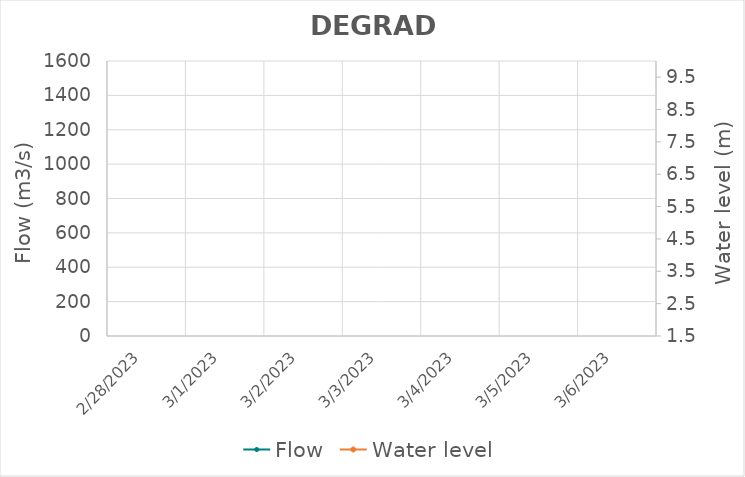
| Category | Flow |
|---|---|
| 4/26/22 | 772.27 |
| 4/25/22 | 760.98 |
| 4/24/22 | 723 |
| 4/23/22 | 658.5 |
| 4/22/22 | 589.73 |
| 4/21/22 | 524.85 |
| 4/20/22 | 493.58 |